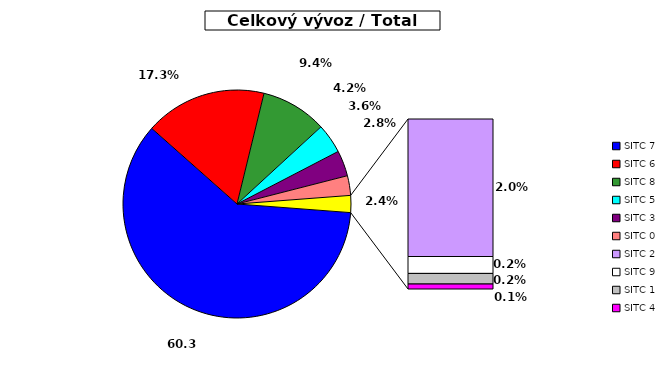
| Category | Series 0 |
|---|---|
| SITC 7 | 60.34 |
| SITC 6 | 17.265 |
| SITC 8 | 9.362 |
| SITC 5 | 4.202 |
| SITC 3 | 3.634 |
| SITC 0 | 2.785 |
| SITC 2 | 1.951 |
| SITC 9 | 0.24 |
| SITC 1 | 0.151 |
| SITC 4 | 0.071 |